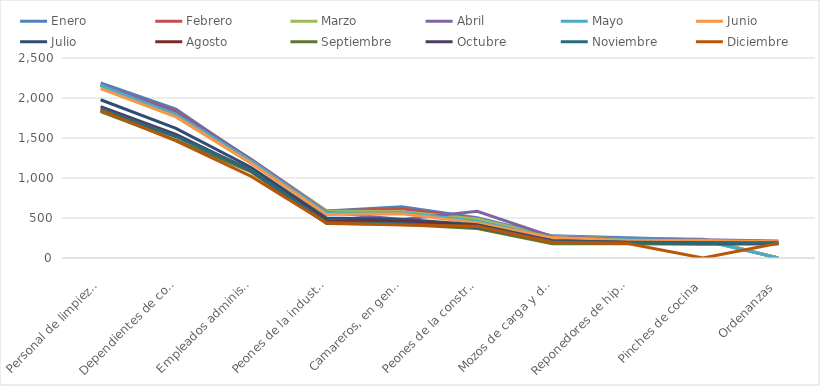
| Category | Enero | Febrero | Marzo | Abril | Mayo | Junio | Julio | Agosto | Septiembre | Octubre | Noviembre | Diciembre |
|---|---|---|---|---|---|---|---|---|---|---|---|---|
| Personal de limpieza o limpiadores en general | 2188 | 2157 | 2164 | 2161 | 2153 | 2118 | 1978 | 1847 | 1829 | 1892 | 1868 | 1845 |
| Dependientes de comercio, en general | 1862 | 1842 | 1812 | 1833 | 1791 | 1763 | 1621 | 1519 | 1473 | 1545 | 1521 | 1465 |
| Empleados administrativos, en general | 1220 | 1231 | 1221 | 1230 | 1211 | 1183 | 1131 | 1102 | 1076 | 1090 | 1096 | 1020 |
| Peones de la industria manufacturera, en general | 588 | 589 | 589 | 573 | 563 | 545 | 501 | 470 | 432 | 453 | 444 | 438 |
| Camareros, en general | 641 | 617 | 579 | 482 | 566 | 552 | 485 | 458 | 419 | 436 | 428 | 412 |
| Peones de la construcción de edificios | 505 | 492 | 489 | 584 | 459 | 439 | 417 | 399 | 368 | 383 | 386 | 397 |
| Mozos de carga y descarga, almacén y/o mercado de abastos | 277 | 259 | 273 | 267 | 254 | 255 | 217 | 186 | 179 | 216 | 202 | 198 |
| Reponedores de hipermercado | 252 | 240 | 239 | 233 | 229 | 218 | 198 | 193 | 179 | 195 | 193 | 182 |
| Pinches de cocina | 226 | 235 | 231 | 229 | 219 | 218 | 191 | 177 | 172 | 184 | 183 | 0 |
| Ordenanzas | 0 | 0 | 0 | 211 | 0 | 204 | 189 | 177 | 180 | 179 | 187 | 184 |